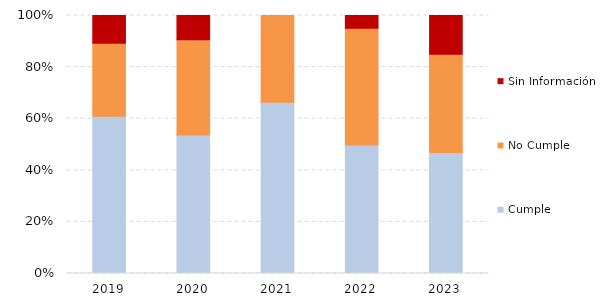
| Category | Cumple | No Cumple | Sin Información |
|---|---|---|---|
| 2019.0 | 147 | 68 | 26 |
| 2020.0 | 131 | 90 | 23 |
| 2021.0 | 207 | 105 | 0 |
| 2022.0 | 120 | 109 | 12 |
| 2023.0 | 122 | 99 | 39 |